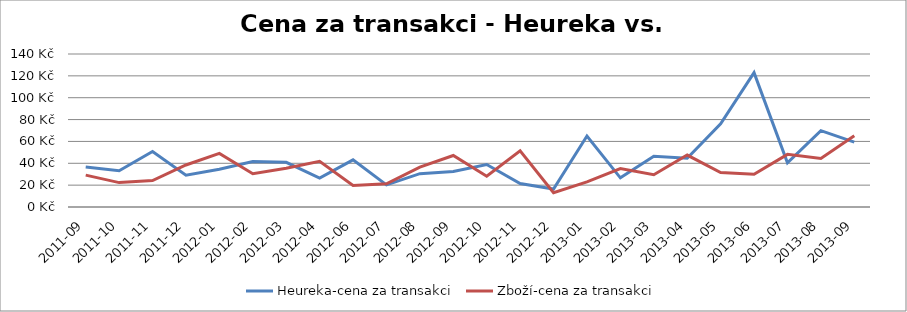
| Category | Heureka-cena za transakci | Zboží-cena za transakci |
|---|---|---|
| 2011-09 | 36.606 | 29.15 |
| 2011-10 | 33.146 | 22.316 |
| 2011-11 | 50.746 | 24.141 |
| 2011-12 | 29.152 | 38.429 |
| 2012-01 | 34.537 | 49.09 |
| 2012-02 | 41.659 | 30.426 |
| 2012-03 | 40.905 | 35.523 |
| 2012-04 | 26.503 | 41.878 |
| 2012-06 | 43.121 | 19.729 |
| 2012-07 | 20.179 | 21.269 |
| 2012-08 | 30.516 | 36.56 |
| 2012-09 | 32.468 | 47.137 |
| 2012-10 | 38.899 | 28.097 |
| 2012-11 | 21.519 | 51.379 |
| 2012-12 | 16.414 | 13.096 |
| 2013-01 | 64.937 | 23.054 |
| 2013-02 | 26.673 | 35.18 |
| 2013-03 | 46.386 | 29.546 |
| 2013-04 | 44.672 | 47.512 |
| 2013-05 | 76.077 | 31.491 |
| 2013-06 | 122.925 | 29.984 |
| 2013-07 | 40.408 | 48.177 |
| 2013-08 | 69.87 | 44.44 |
| 2013-09 | 59.363 | 65.183 |